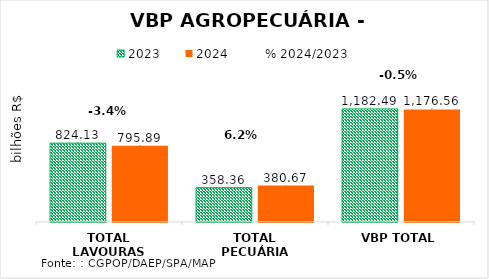
| Category | 2023 | 2024 |
|---|---|---|
| TOTAL LAVOURAS | 824.132 | 795.894 |
| TOTAL PECUÁRIA | 358.362 | 380.667 |
| VBP TOTAL | 1182.494 | 1176.561 |